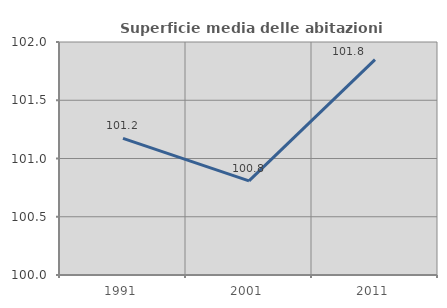
| Category | Superficie media delle abitazioni occupate |
|---|---|
| 1991.0 | 101.173 |
| 2001.0 | 100.808 |
| 2011.0 | 101.848 |